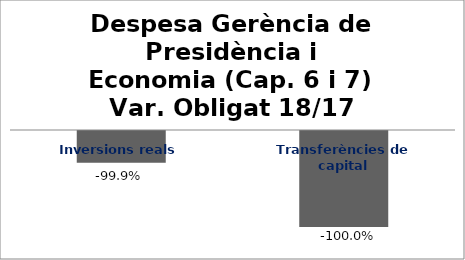
| Category | Series 0 |
|---|---|
| Inversions reals | -0.999 |
| Transferències de capital | -1 |